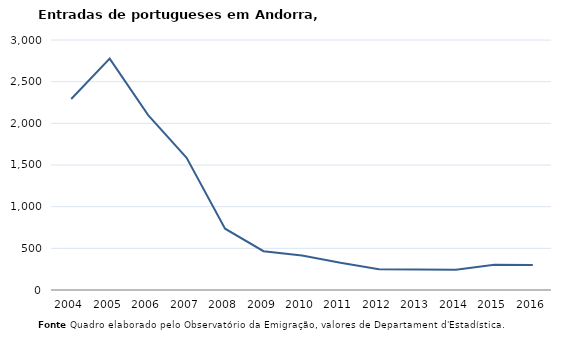
| Category | Entradas |
|---|---|
| 2004.0 | 2292 |
| 2005.0 | 2776 |
| 2006.0 | 2099 |
| 2007.0 | 1587 |
| 2008.0 | 736 |
| 2009.0 | 466 |
| 2010.0 | 415 |
| 2011.0 | 327 |
| 2012.0 | 250 |
| 2013.0 | 246 |
| 2014.0 | 244 |
| 2015.0 | 303 |
| 2016.0 | 301 |